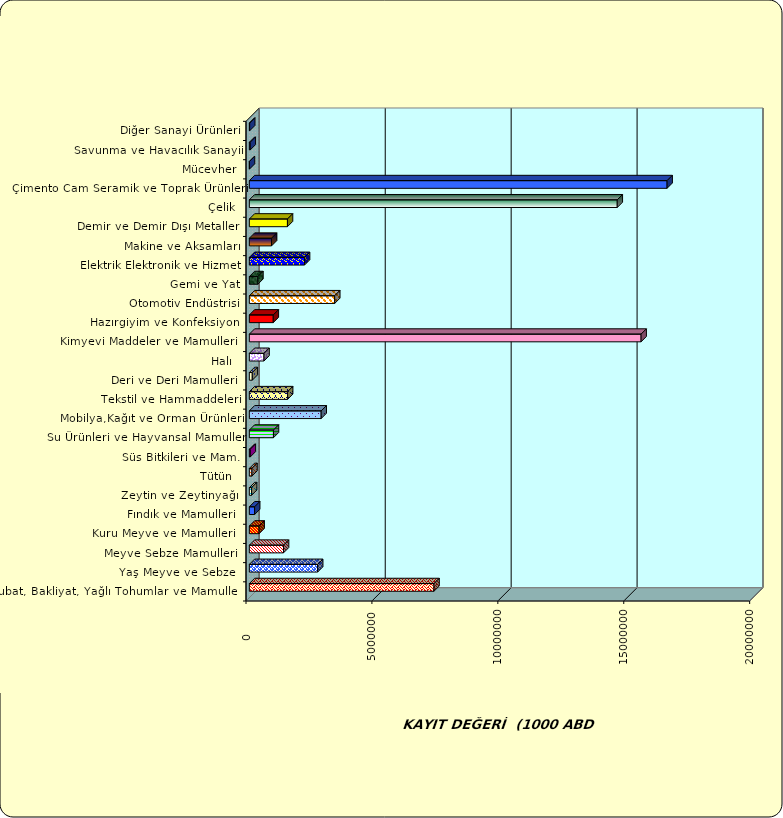
| Category | Series 0 |
|---|---|
|  Hububat, Bakliyat, Yağlı Tohumlar ve Mamulleri  | 7332302.007 |
|  Yaş Meyve ve Sebze   | 2711960.207 |
|  Meyve Sebze Mamulleri  | 1357052.61 |
|  Kuru Meyve ve Mamulleri   | 386810.233 |
|  Fındık ve Mamulleri  | 210218.256 |
|  Zeytin ve Zeytinyağı  | 88741.234 |
|  Tütün  | 102286.299 |
|  Süs Bitkileri ve Mam. | 37751.666 |
|  Su Ürünleri ve Hayvansal Mamuller | 957145.974 |
|  Mobilya,Kağıt ve Orman Ürünleri | 2852494.392 |
|  Tekstil ve Hammaddeleri | 1518721.7 |
|  Deri ve Deri Mamulleri  | 116625.813 |
|  Halı  | 582116.136 |
|  Kimyevi Maddeler ve Mamulleri   | 15555583.586 |
|  Hazırgiyim ve Konfeksiyon  | 950169.366 |
|  Otomotiv Endüstrisi | 3389808.147 |
|  Gemi ve Yat | 338780.977 |
|  Elektrik Elektronik ve Hizmet | 2191223.551 |
|  Makine ve Aksamları | 882102.993 |
|  Demir ve Demir Dışı Metaller  | 1513547.933 |
|  Çelik | 14609147.998 |
|  Çimento Cam Seramik ve Toprak Ürünleri | 16588368.055 |
|  Mücevher | 3827.539 |
|  Savunma ve Havacılık Sanayii | 35345.377 |
|  Diğer Sanayi Ürünleri | 13717.115 |